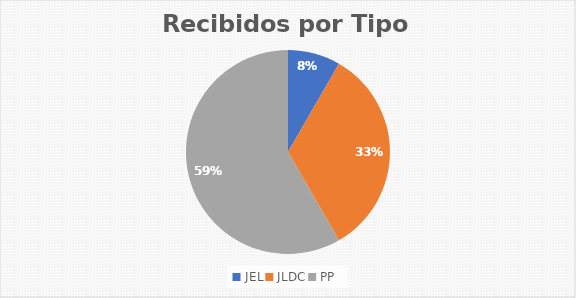
| Category | Series 0 |
|---|---|
| JEL | 3 |
| JLDC | 12 |
| PP | 21 |